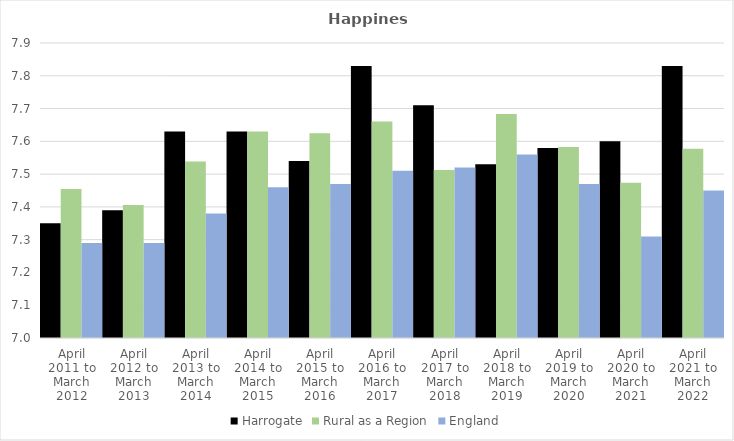
| Category | Harrogate | Rural as a Region | England |
|---|---|---|---|
| April 2011 to March 2012 | 7.35 | 7.454 | 7.29 |
| April 2012 to March 2013 | 7.39 | 7.406 | 7.29 |
| April 2013 to March 2014 | 7.63 | 7.539 | 7.38 |
| April 2014 to March 2015 | 7.63 | 7.63 | 7.46 |
| April 2015 to March 2016 | 7.54 | 7.625 | 7.47 |
| April 2016 to March 2017 | 7.83 | 7.661 | 7.51 |
| April 2017 to March 2018 | 7.71 | 7.513 | 7.52 |
| April 2018 to March 2019 | 7.53 | 7.684 | 7.56 |
| April 2019 to March 2020 | 7.58 | 7.582 | 7.47 |
| April 2020 to March 2021 | 7.6 | 7.474 | 7.31 |
| April 2021 to March 2022 | 7.83 | 7.577 | 7.45 |